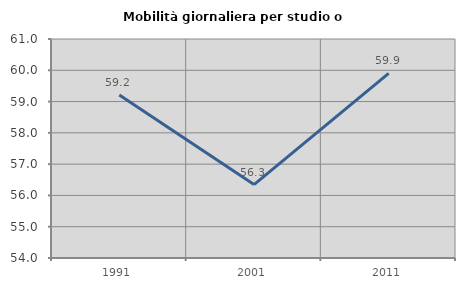
| Category | Mobilità giornaliera per studio o lavoro |
|---|---|
| 1991.0 | 59.207 |
| 2001.0 | 56.348 |
| 2011.0 | 59.904 |